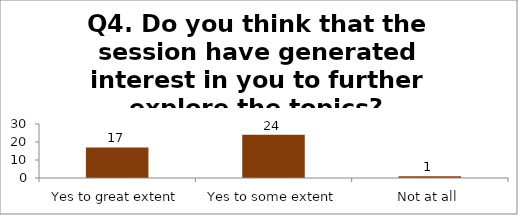
| Category | Q4. Do you think that the session have generated interest in you to further explore the topics? |
|---|---|
| Yes to great extent | 17 |
| Yes to some extent | 24 |
| Not at all | 1 |